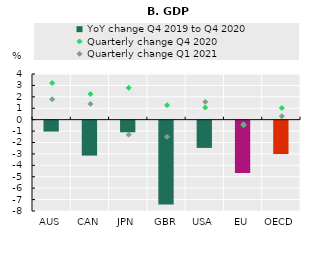
| Category | YoY change Q4 2019 to Q4 2020 |
|---|---|
| AUS | -0.955 |
| CAN | -3.059 |
| JPN | -1.017 |
| GBR | -7.341 |
| USA | -2.387 |
| EU | -4.591 |
| OECD | -2.924 |